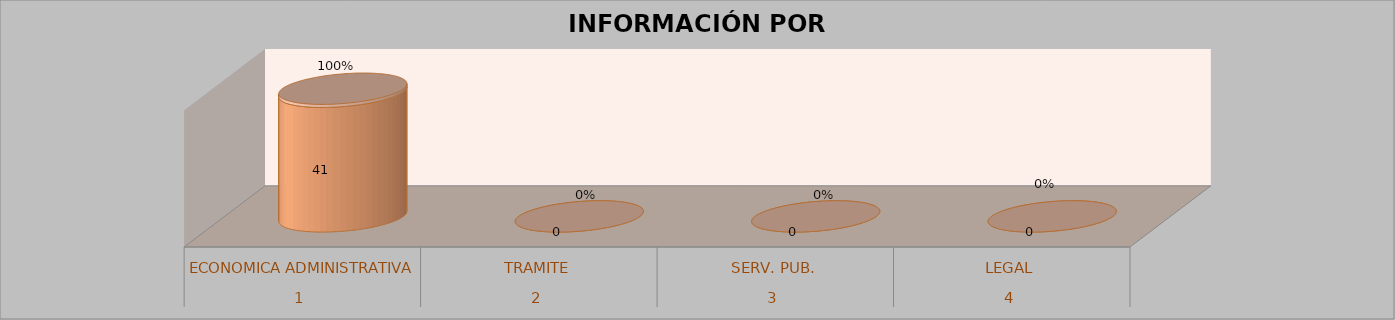
| Category | Series 0 | Series 1 | Series 2 | Series 3 |
|---|---|---|---|---|
| 0 |  |  | 41 | 1 |
| 1 |  |  | 0 | 0 |
| 2 |  |  | 0 | 0 |
| 3 |  |  | 0 | 0 |